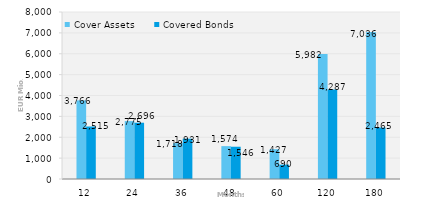
| Category | Cover Assets | Covered Bonds |
|---|---|---|
| 12.0 | 3766.351 | 2515.227 |
| 24.0 | 2774.644 | 2696.089 |
| 36.0 | 1718.218 | 1931.433 |
| 48.0 | 1573.978 | 1545.778 |
| 60.0 | 1427.017 | 689.876 |
| 120.0 | 5982.362 | 4287.482 |
| 180.0 | 7036.291 | 2464.54 |